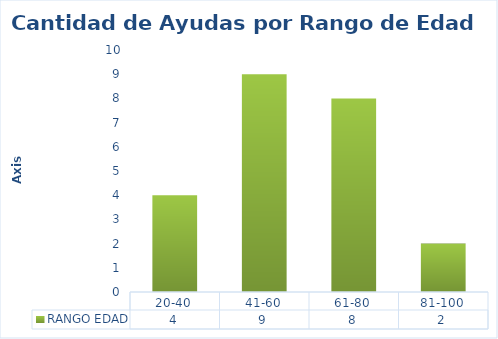
| Category | RANGO EDAD |
|---|---|
| 20-40 | 4 |
| 41-60 | 9 |
| 61-80 | 8 |
| 81-100 | 2 |